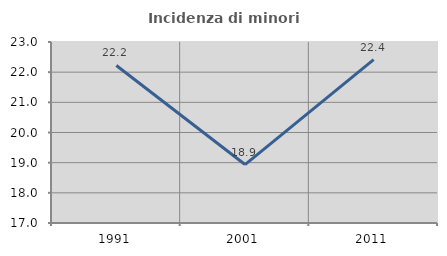
| Category | Incidenza di minori stranieri |
|---|---|
| 1991.0 | 22.222 |
| 2001.0 | 18.938 |
| 2011.0 | 22.414 |